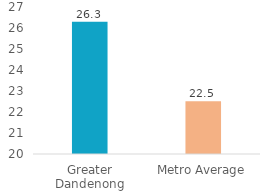
| Category | Series 0 |
|---|---|
| Greater Dandenong | 26.297 |
| Metro Average | 22.517 |